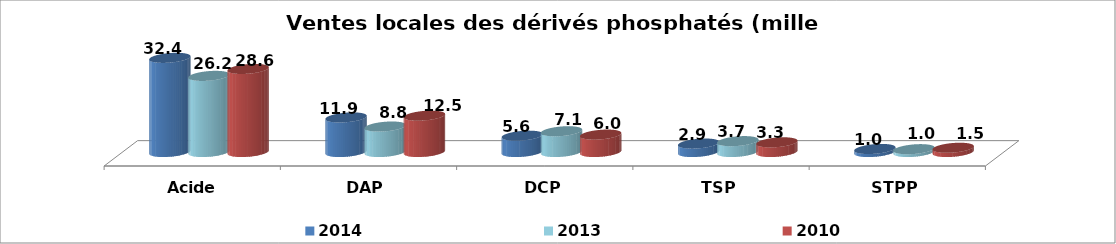
| Category | 2014 | 2013 | 2010 |
|---|---|---|---|
| Acide Phosphorique 54% | 32.417 | 26.206 | 28.601 |
| DAP | 11.895 | 8.766 | 12.507 |
| DCP | 5.615 | 7.139 | 5.988 |
| TSP | 2.904 | 3.737 | 3.325 |
| STPP | 1.044 | 0.97 | 1.451 |